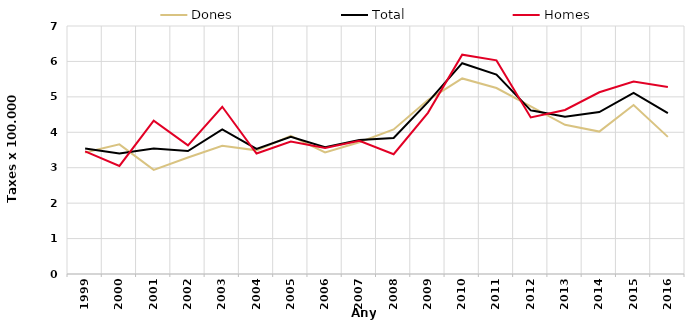
| Category | Dones | Total | Homes |
|---|---|---|---|
| 1999.0 | 3.43 | 3.54 | 3.46 |
| 2000.0 | 3.66 | 3.4 | 3.05 |
| 2001.0 | 2.94 | 3.54 | 4.33 |
| 2002.0 | 3.29 | 3.47 | 3.63 |
| 2003.0 | 3.62 | 4.08 | 4.72 |
| 2004.0 | 3.49 | 3.53 | 3.4 |
| 2005.0 | 3.9 | 3.87 | 3.74 |
| 2006.0 | 3.43 | 3.58 | 3.56 |
| 2007.0 | 3.72 | 3.78 | 3.76 |
| 2008.0 | 4.08 | 3.84 | 3.38 |
| 2009.0 | 4.91 | 4.85 | 4.55 |
| 2010.0 | 5.52 | 5.95 | 6.19 |
| 2011.0 | 5.25 | 5.63 | 6.03 |
| 2012.0 | 4.73 | 4.62 | 4.42 |
| 2013.0 | 4.21 | 4.44 | 4.63 |
| 2014.0 | 4.02 | 4.57 | 5.13 |
| 2015.0 | 4.77 | 5.11 | 5.43 |
| 2016.0 | 3.87 | 4.54 | 5.28 |